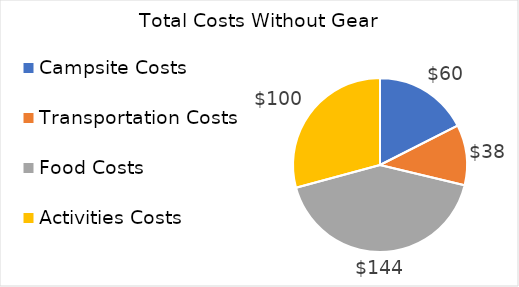
| Category | Series 0 |
|---|---|
| Campsite Costs  | 60 |
| Transportation Costs  | 38.36 |
| Food Costs  | 144 |
| Activities Costs  | 100 |